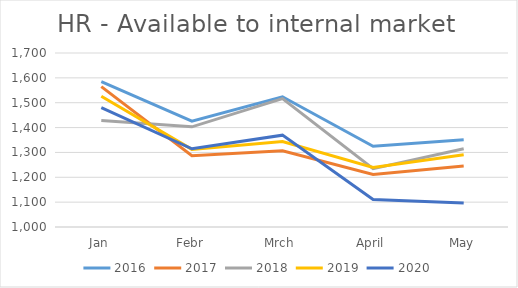
| Category | 2016 | 2017 | 2018 | 2019 | 2020 |
|---|---|---|---|---|---|
| Jan | 1585 | 1564.787 | 1428.198 | 1525.749 | 1480.456 |
| Febr | 1426 | 1286.883 | 1402.999 | 1312.198 | 1314.737 |
| Mrch | 1524 | 1306.641 | 1516.406 | 1343.604 | 1369.51 |
| April | 1325 | 1211.586 | 1234.845 | 1239.179 | 1110.529 |
| May | 1351 | 1245.244 | 1314.899 | 1290.4 | 1096.875 |